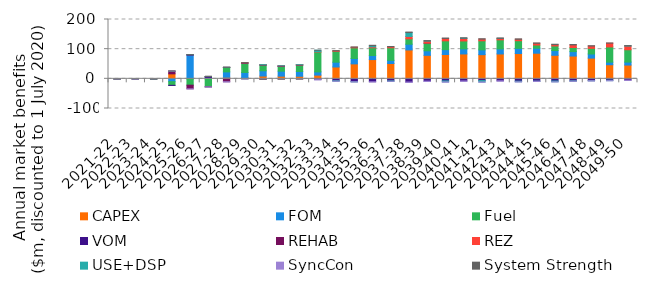
| Category | CAPEX | FOM | Fuel | VOM | REHAB | REZ | USE+DSP | SyncCon | System Strength |
|---|---|---|---|---|---|---|---|---|---|
| 2021-22 | 0 | 0 | -0.257 | 0.035 | 0 | 0 | 0 | -0.003 | 0 |
| 2022-23 | 0 | 0 | -1.151 | 0.205 | 0 | 0 | 0 | -0.006 | 0 |
| 2023-24 | 0 | 0 | -1.334 | 0.206 | 0 | 0 | 0 | 0.002 | 0 |
| 2024-25 | 16.814 | -9.556 | -12.303 | -0.313 | 8.876 | 0 | 0.044 | 0.32 | 0.341 |
| 2025-26 | 0.09 | 79.573 | -21.365 | 1.902 | -12.34 | 0 | 0 | -0.033 | 0 |
| 2026-27 | 0.086 | 4.35 | -26.76 | 3.725 | -0.431 | 0 | 0 | -0.564 | 0 |
| 2027-28 | 5.265 | 18.117 | 15.006 | 0.43 | -9.746 | 0 | 0 | -0.818 | 0 |
| 2028-29 | 4.357 | 17.103 | 31.004 | 1.131 | 0 | 1.028 | -0.079 | -0.804 | 0.029 |
| 2029-30 | 9.484 | 17.653 | 19.185 | 0.827 | -0.387 | 0.561 | 0 | -1.034 | -0.034 |
| 2030-31 | 9.051 | 16.791 | 15.835 | 1.586 | 0.107 | 0.536 | 0 | -1.02 | -0.032 |
| 2031-32 | 8.66 | 15.986 | 21.957 | 0.224 | 0.011 | 0.725 | 0 | -0.726 | -0.031 |
| 2032-33 | 12.49 | 10.836 | 66.943 | -2.698 | 0 | 1.202 | 4.899 | -0.454 | 0.063 |
| 2033-34 | 39.952 | 16.186 | 36.65 | -6.554 | 0 | 1.635 | -1.009 | -0.508 | 0.663 |
| 2034-35 | 50.456 | 18.056 | 35.997 | -9.828 | 0 | 2.026 | -0.052 | -0.069 | 0.902 |
| 2035-36 | 64.923 | 13.705 | 26.086 | -9.949 | 0 | 3.041 | 4.109 | -0.164 | 1.224 |
| 2036-37 | 51.745 | 10.638 | 42.312 | -7.114 | 0 | 3.41 | -0.932 | -0.209 | 0.839 |
| 2037-38 | 97.373 | 19.311 | 18.137 | -10.781 | 0 | 8.066 | 13.081 | -1.13 | 1.699 |
| 2038-39 | 79.274 | 15.198 | 25.888 | -7.804 | 0 | 6.989 | 0.208 | -1.179 | 1.362 |
| 2039-40 | 82.067 | 16.302 | 29.713 | -6.999 | 0 | 8.035 | -3.223 | -1.223 | 1.386 |
| 2040-41 | 83.901 | 17.064 | 26.693 | -7.173 | 0 | 8.46 | 0.976 | -1.092 | 1.361 |
| 2041-42 | 81.488 | 16.162 | 30.521 | -6.009 | 0 | 5.575 | -4.489 | -1.108 | 1.394 |
| 2042-43 | 83.874 | 16.804 | 30.72 | -6.671 | 0 | 4.956 | 0.091 | -1.016 | 1.252 |
| 2043-44 | 85.282 | 17.527 | 25.666 | -7.881 | 0 | 4.81 | -1.935 | -0.774 | 1.409 |
| 2044-45 | 86.353 | 16.86 | 10.778 | -8.038 | 0 | 5.656 | -0.043 | -0.736 | 1.369 |
| 2045-46 | 79.384 | 15.979 | 15.524 | -7.411 | 0 | 4.386 | -2.508 | -0.667 | 1.319 |
| 2046-47 | 76.83 | 15.024 | 13.809 | -6.998 | 0 | 8.717 | -0.515 | -0.651 | 1.314 |
| 2047-48 | 69.85 | 13.909 | 19.044 | -6.221 | 0 | 7.617 | -0.143 | -0.631 | 1.212 |
| 2048-49 | 47.521 | 8.777 | 51.354 | -4.549 | 0 | 12.501 | -1.538 | -0.565 | 0.678 |
| 2049-50 | 46.43 | 10.055 | 41.53 | -4.271 | 0 | 12.63 | 0.536 | -0.555 | 0.879 |